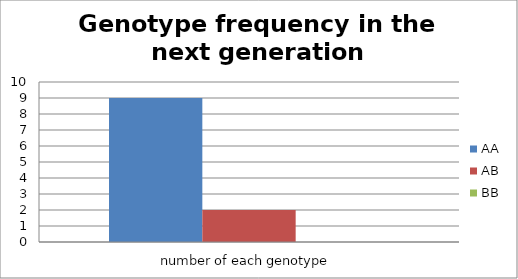
| Category | AA | AB | BB |
|---|---|---|---|
| number of each genotype | 9 | 2 | 0 |